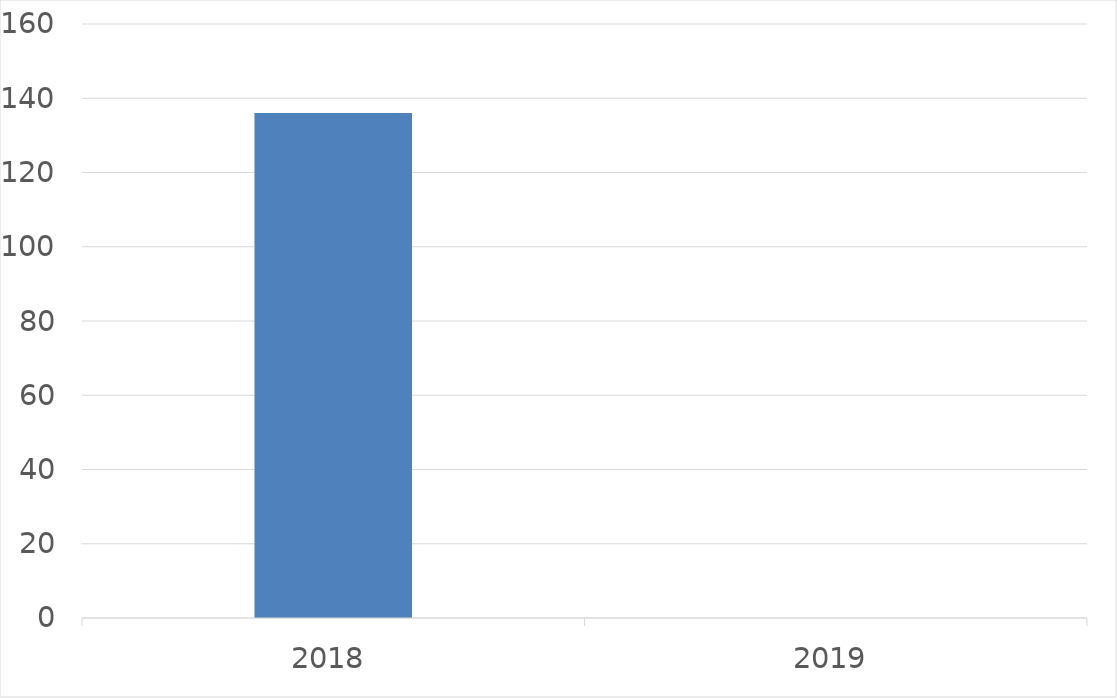
| Category | Series 0 |
|---|---|
| 2018 | 136 |
| 2019 | 0 |